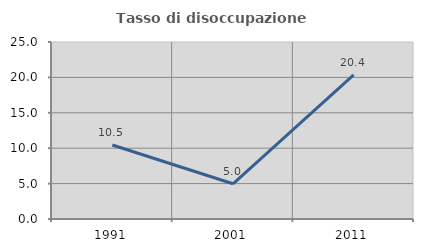
| Category | Tasso di disoccupazione giovanile  |
|---|---|
| 1991.0 | 10.453 |
| 2001.0 | 4.972 |
| 2011.0 | 20.359 |